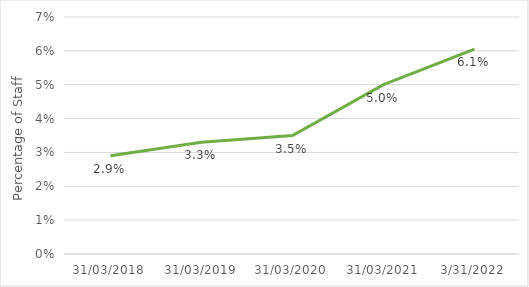
| Category | Total |
|---|---|
| 31/03/2018 | 0.029 |
| 31/03/2019 | 0.033 |
| 31/03/2020 | 0.035 |
| 31/03/2021 | 0.05 |
| 31/03/2022 | 0.061 |